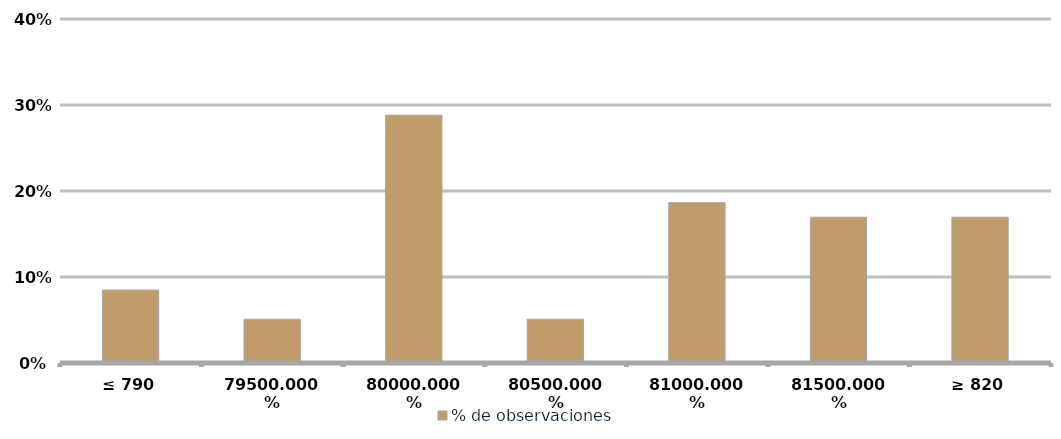
| Category | % de observaciones  |
|---|---|
| ≤ 790 | 0.085 |
| 795 | 0.051 |
| 800 | 0.288 |
| 805 | 0.051 |
| 810 | 0.186 |
| 815 | 0.169 |
| ≥ 820 | 0.169 |